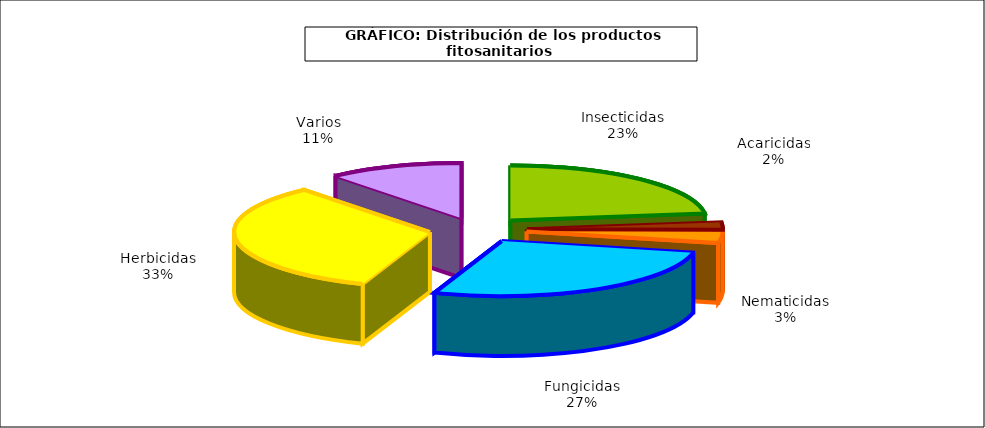
| Category | Insecticidas |
|---|---|
| Insecticidas | 387.953 |
| Acaricidas | 37.219 |
| Nematicidas | 54.631 |
| Fungicidas | 459.496 |
| Herbicidas | 563.108 |
| Varios | 187.65 |